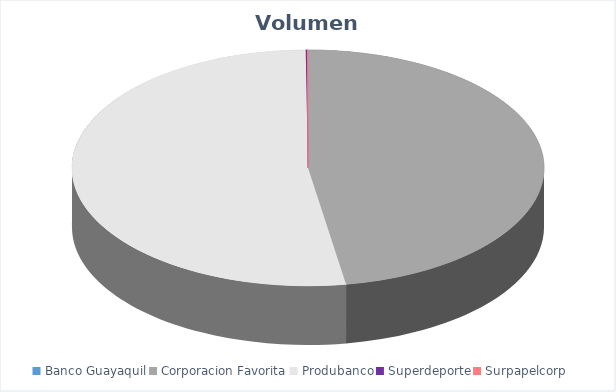
| Category | VOLUMEN ($USD) |
|---|---|
| Banco Guayaquil | 77.35 |
| Corporacion Favorita | 159251.46 |
| Produbanco | 176123.92 |
| Superdeporte | 302.5 |
| Surpapelcorp | 212.5 |